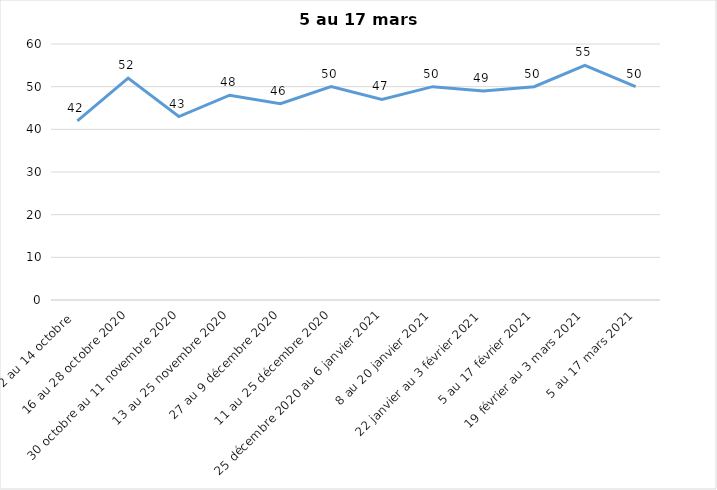
| Category | Toujours aux trois mesures |
|---|---|
| 2 au 14 octobre  | 42 |
| 16 au 28 octobre 2020 | 52 |
| 30 octobre au 11 novembre 2020 | 43 |
| 13 au 25 novembre 2020 | 48 |
| 27 au 9 décembre 2020 | 46 |
| 11 au 25 décembre 2020 | 50 |
| 25 décembre 2020 au 6 janvier 2021 | 47 |
| 8 au 20 janvier 2021 | 50 |
| 22 janvier au 3 février 2021 | 49 |
| 5 au 17 février 2021 | 50 |
| 19 février au 3 mars 2021 | 55 |
| 5 au 17 mars 2021 | 50 |